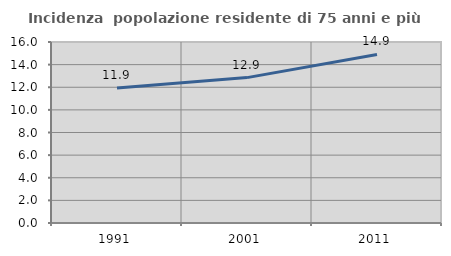
| Category | Incidenza  popolazione residente di 75 anni e più |
|---|---|
| 1991.0 | 11.931 |
| 2001.0 | 12.853 |
| 2011.0 | 14.9 |